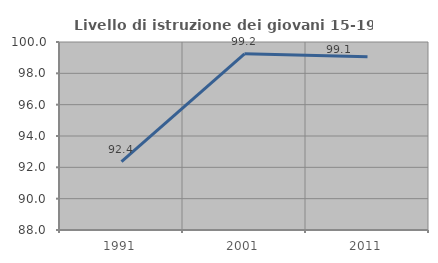
| Category | Livello di istruzione dei giovani 15-19 anni |
|---|---|
| 1991.0 | 92.366 |
| 2001.0 | 99.248 |
| 2011.0 | 99.065 |